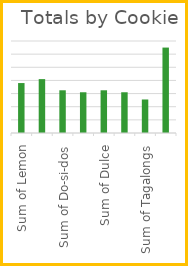
| Category | Total |
|---|---|
| Sum of Lemon | 76 |
| Sum of Trefoils | 82 |
| Sum of Do-si-dos | 65 |
| Sum of Samoas | 62 |
| Sum of Dulce | 65 |
| Sum of Thank U | 62 |
| Sum of Tagalongs | 51 |
| Sum of Thin Mints | 130 |